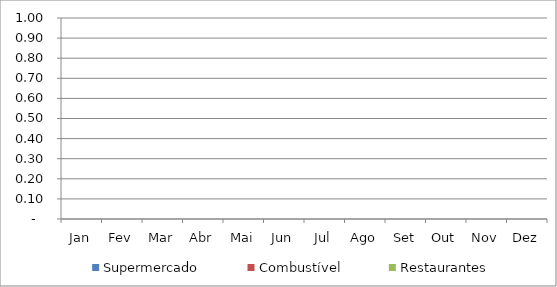
| Category | Supermercado | Combustível | Restaurantes |
|---|---|---|---|
|  Jan  | 0 | 0 | 0 |
|  Fev  | 0 | 0 | 0 |
|  Mar  | 0 | 0 | 0 |
|  Abr  | 0 | 0 | 0 |
|  Mai  | 0 | 0 | 0 |
|  Jun  | 0 | 0 | 0 |
|  Jul  | 0 | 0 | 0 |
|  Ago  | 0 | 0 | 0 |
|  Set  | 0 | 0 | 0 |
|  Out  | 0 | 0 | 0 |
|  Nov  | 0 | 0 | 0 |
|  Dez  | 0 | 0 | 0 |